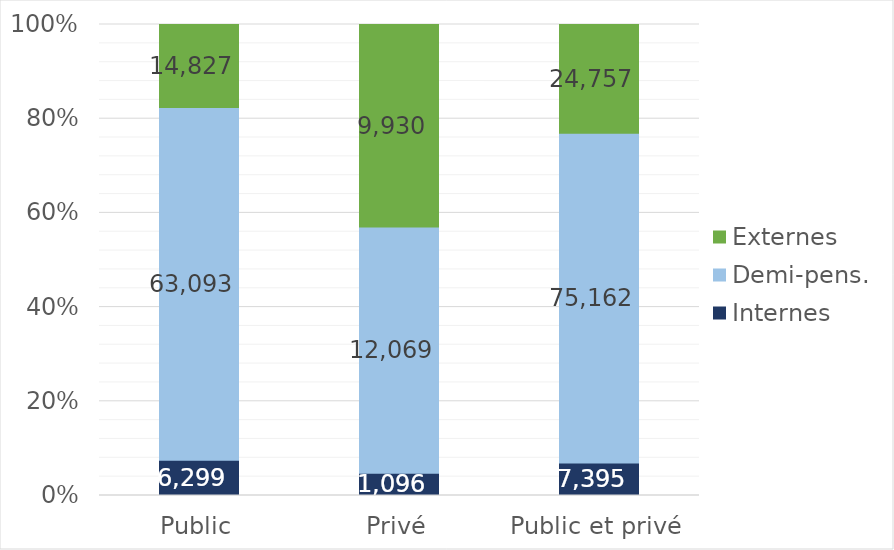
| Category | Internes | Demi-pens. | Externes |
|---|---|---|---|
| Public | 6299 | 63093 | 14827 |
| Privé | 1096 | 12069 | 9930 |
| Public et privé | 7395 | 75162 | 24757 |